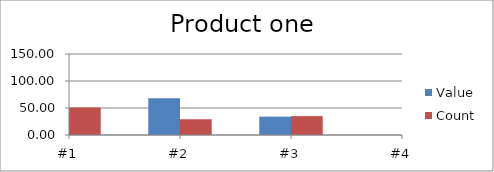
| Category | Value | Count |
|---|---|---|
| #1 | 100 | 51 |
| #2 | 68 | 29 |
| #3 | 34 | 35 |
| #4 | 0 | 43 |